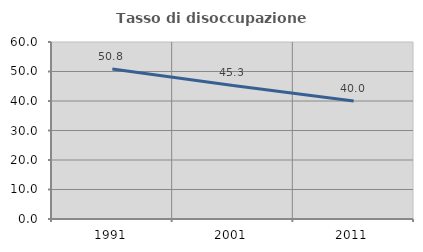
| Category | Tasso di disoccupazione giovanile  |
|---|---|
| 1991.0 | 50.811 |
| 2001.0 | 45.275 |
| 2011.0 | 40 |